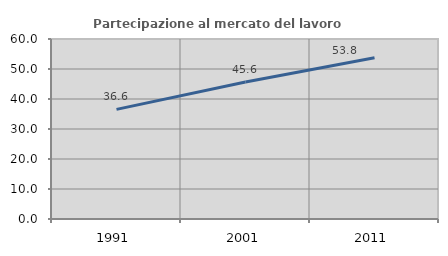
| Category | Partecipazione al mercato del lavoro  femminile |
|---|---|
| 1991.0 | 36.551 |
| 2001.0 | 45.645 |
| 2011.0 | 53.753 |